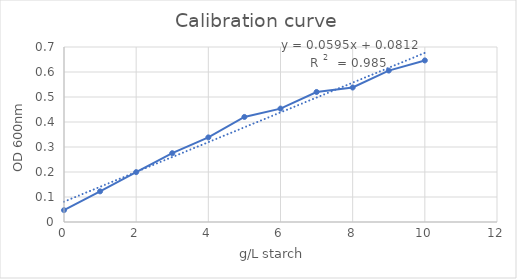
| Category | Series 0 |
|---|---|
| 0.0 | 0.047 |
| 1.0 | 0.123 |
| 2.0 | 0.2 |
| 3.0 | 0.275 |
| 4.0 | 0.338 |
| 5.0 | 0.42 |
| 6.0 | 0.454 |
| 7.0 | 0.52 |
| 8.0 | 0.538 |
| 9.0 | 0.606 |
| 10.0 | 0.646 |